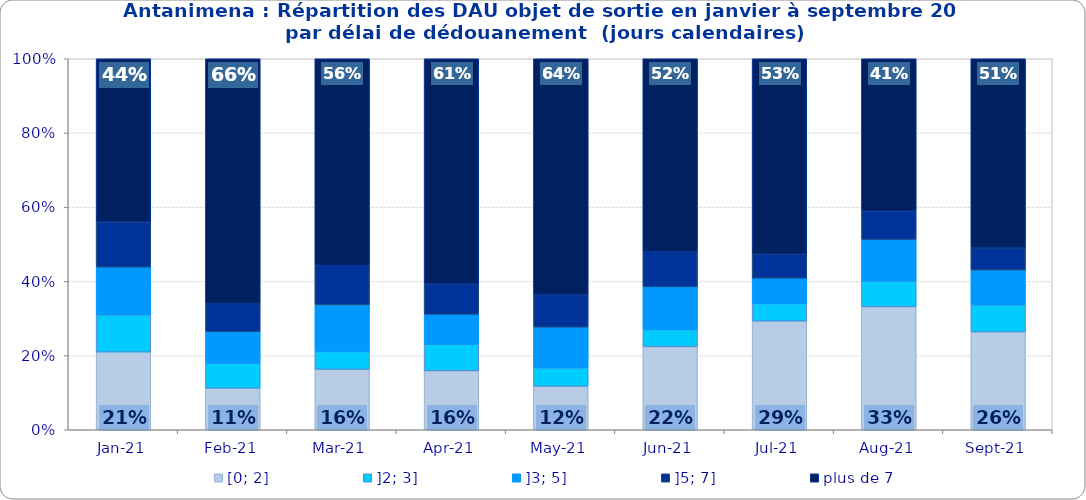
| Category | [0; 2] | ]2; 3] | ]3; 5] | ]5; 7] | plus de 7 |
|---|---|---|---|---|---|
| 2021-01-01 | 0.21 | 0.1 | 0.129 | 0.122 | 0.44 |
| 2021-02-01 | 0.112 | 0.068 | 0.085 | 0.076 | 0.659 |
| 2021-03-01 | 0.163 | 0.048 | 0.126 | 0.106 | 0.557 |
| 2021-04-01 | 0.159 | 0.072 | 0.081 | 0.082 | 0.606 |
| 2021-05-01 | 0.117 | 0.05 | 0.11 | 0.087 | 0.636 |
| 2021-06-01 | 0.224 | 0.046 | 0.115 | 0.096 | 0.519 |
| 2021-07-01 | 0.293 | 0.047 | 0.069 | 0.065 | 0.527 |
| 2021-08-01 | 0.332 | 0.069 | 0.113 | 0.077 | 0.41 |
| 2021-09-01 | 0.264 | 0.073 | 0.094 | 0.06 | 0.509 |